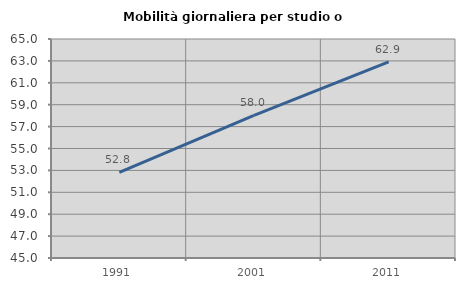
| Category | Mobilità giornaliera per studio o lavoro |
|---|---|
| 1991.0 | 52.828 |
| 2001.0 | 58.03 |
| 2011.0 | 62.92 |